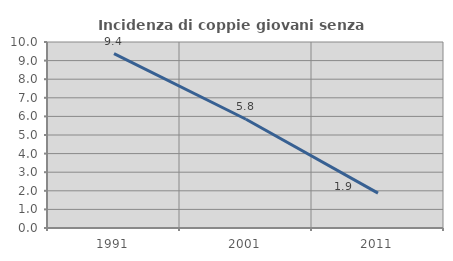
| Category | Incidenza di coppie giovani senza figli |
|---|---|
| 1991.0 | 9.375 |
| 2001.0 | 5.848 |
| 2011.0 | 1.875 |